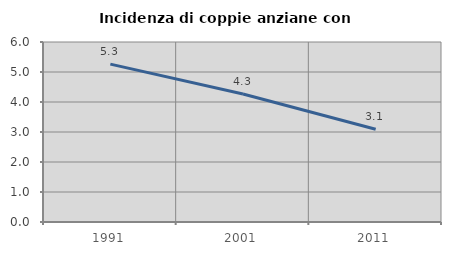
| Category | Incidenza di coppie anziane con figli |
|---|---|
| 1991.0 | 5.263 |
| 2001.0 | 4.266 |
| 2011.0 | 3.093 |